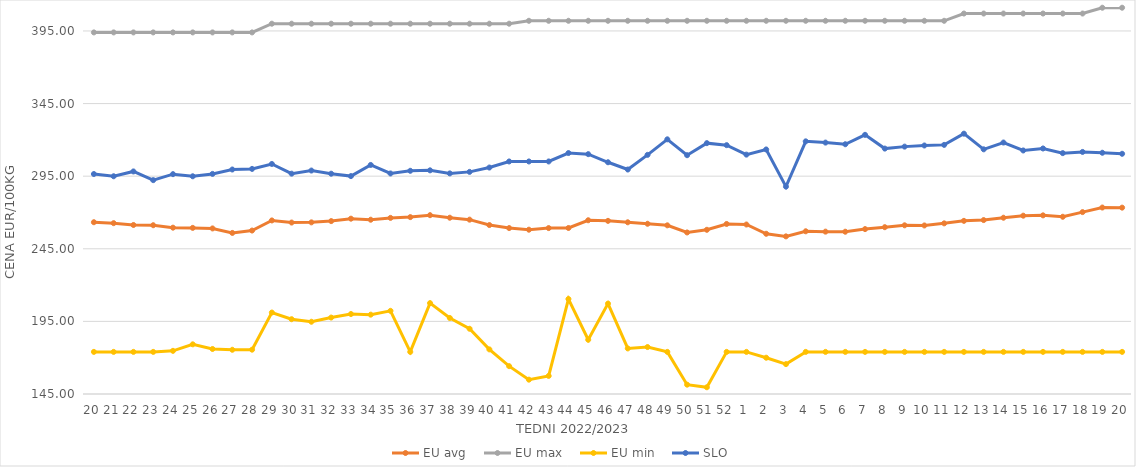
| Category | EU avg | EU max | EU min | SLO |
|---|---|---|---|---|
| 20.0 | 263.291 | 394 | 174 | 296.48 |
| 21.0 | 262.64 | 394 | 174 | 294.94 |
| 22.0 | 261.388 | 394 | 174 | 298.26 |
| 23.0 | 261.228 | 394 | 174 | 292.27 |
| 24.0 | 259.544 | 394 | 174.72 | 296.39 |
| 25.0 | 259.395 | 394 | 179.2 | 294.93 |
| 26.0 | 259.018 | 394 | 176 | 296.56 |
| 27.0 | 255.922 | 394 | 175.451 | 299.59 |
| 28.0 | 257.564 | 394 | 175.52 | 300.01 |
| 29.0 | 264.52 | 400 | 201.097 | 303.41 |
| 30.0 | 263.067 | 400 | 196.496 | 296.73 |
| 31.0 | 263.196 | 400 | 194.756 | 298.88 |
| 32.0 | 264.059 | 400 | 197.634 | 296.7 |
| 33.0 | 265.729 | 400 | 200.07 | 295.05 |
| 34.0 | 265.016 | 400 | 199.637 | 302.73 |
| 35.0 | 266.273 | 400 | 202.277 | 296.86 |
| 36.0 | 266.807 | 400 | 174 | 298.7 |
| 37.0 | 268.136 | 400 | 207.594 | 299.02 |
| 38.0 | 266.39 | 400 | 197.352 | 296.91 |
| 39.0 | 265.059 | 400 | 189.926 | 297.96 |
| 40.0 | 261.35 | 400 | 175.723 | 300.95 |
| 41.0 | 259.271 | 400 | 164.165 | 305.13 |
| 42.0 | 258.146 | 402 | 154.869 | 305.13 |
| 43.0 | 259.256 | 402 | 157.459 | 305.13 |
| 44.0 | 259.32 | 402 | 210.415 | 310.93 |
| 45.0 | 264.649 | 402 | 182.35 | 310.16 |
| 46.0 | 264.228 | 402 | 207.247 | 304.58 |
| 47.0 | 263.24 | 402 | 176.378 | 299.59 |
| 48.0 | 262.225 | 402 | 177.332 | 309.69 |
| 49.0 | 261.152 | 402 | 174 | 320.38 |
| 50.0 | 256.24 | 402 | 151.434 | 309.44 |
| 51.0 | 258.071 | 402 | 149.638 | 317.74 |
| 52.0 | 262.088 | 402 | 174 | 316.36 |
| 1.0 | 261.716 | 402 | 174 | 309.84 |
| 2.0 | 255.331 | 402 | 169.983 | 313.4 |
| 3.0 | 253.546 | 402 | 165.574 | 287.81 |
| 4.0 | 257.051 | 402 | 174 | 318.98 |
| 5.0 | 256.808 | 402 | 174 | 318.13 |
| 6.0 | 256.75 | 402 | 174 | 316.99 |
| 7.0 | 258.565 | 402 | 174 | 323.47 |
| 8.0 | 259.872 | 402 | 174 | 314 |
| 9.0 | 261.164 | 402 | 174 | 315.35 |
| 10.0 | 261.06 | 402 | 174 | 316.13 |
| 11.0 | 262.513 | 402 | 174 | 316.55 |
| 12.0 | 264.228 | 407 | 174 | 324.27 |
| 13.0 | 264.768 | 407 | 174 | 313.49 |
| 14.0 | 266.385 | 407 | 174 | 318.17 |
| 15.0 | 267.797 | 407 | 174 | 312.7 |
| 16.0 | 268.021 | 407 | 174 | 314.07 |
| 17.0 | 267.041 | 407 | 174 | 310.87 |
| 18.0 | 270.255 | 407 | 174 | 311.69 |
| 19.0 | 273.406 | 411 | 174 | 311.13 |
| 20.0 | 273.327 | 411 | 174 | 310.42 |